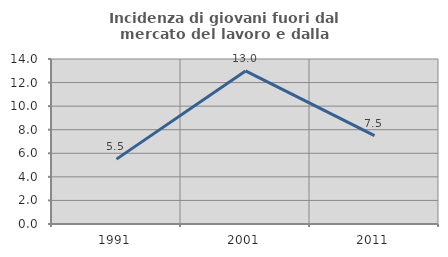
| Category | Incidenza di giovani fuori dal mercato del lavoro e dalla formazione  |
|---|---|
| 1991.0 | 5.505 |
| 2001.0 | 12.991 |
| 2011.0 | 7.5 |